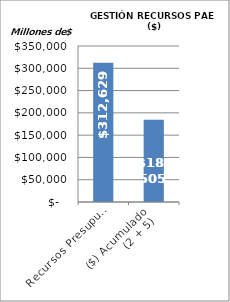
| Category | RECURSOS PAE ($) |
|---|---|
| Recursos Presupuestados | 312629.192 |
| ($) Acumulado
(2 + 5) | 184504.96 |